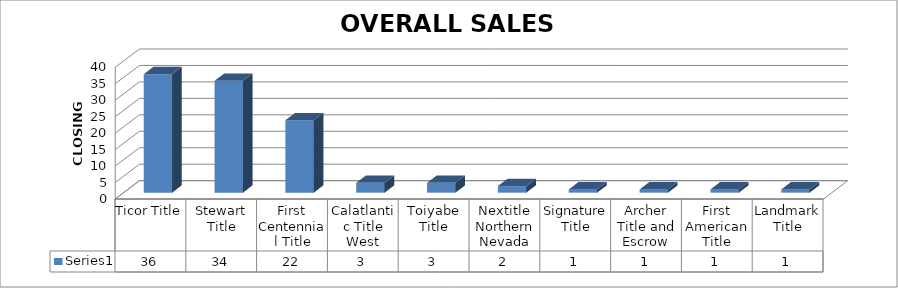
| Category | Series 0 |
|---|---|
| Ticor Title | 36 |
| Stewart Title | 34 |
| First Centennial Title | 22 |
| Calatlantic Title West | 3 |
| Toiyabe Title | 3 |
| Nextitle Northern Nevada | 2 |
| Signature Title | 1 |
| Archer Title and Escrow | 1 |
| First American Title | 1 |
| Landmark Title | 1 |